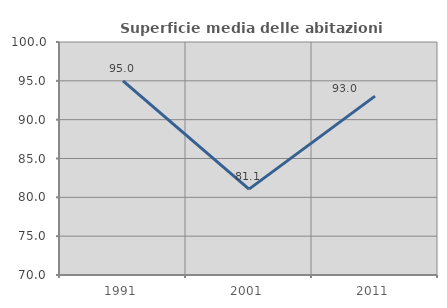
| Category | Superficie media delle abitazioni occupate |
|---|---|
| 1991.0 | 94.992 |
| 2001.0 | 81.06 |
| 2011.0 | 93.034 |